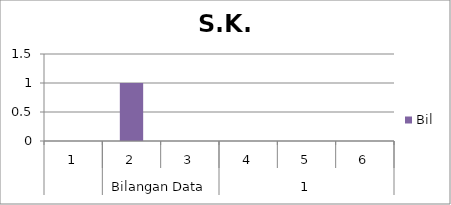
| Category | Bil |
|---|---|
| 0 | 0 |
| 1 | 1 |
| 2 | 0 |
| 3 | 0 |
| 4 | 0 |
| 5 | 0 |